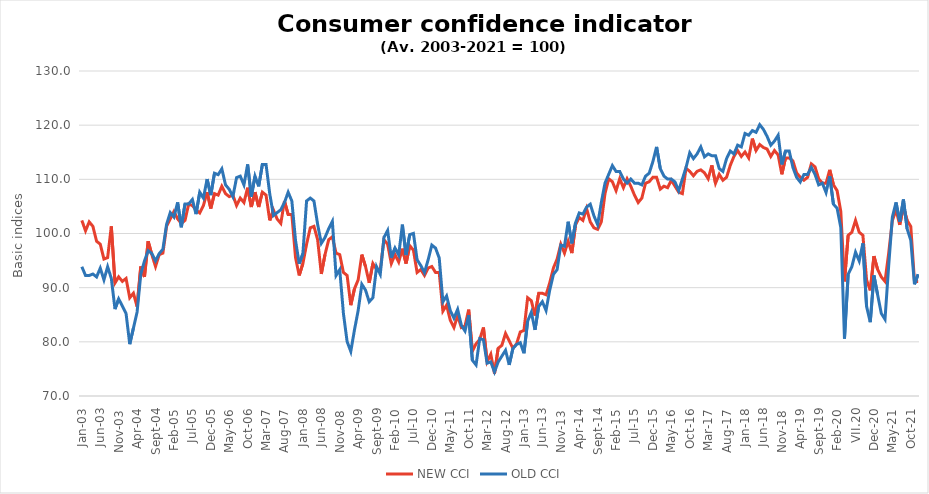
| Category | NEW CCI | OLD CCI |
|---|---|---|
| I.03 | 102.418 | 93.867 |
| II.03 | 100.496 | 92.248 |
| III.03 | 102.144 | 92.248 |
| IV.03 | 101.32 | 92.518 |
| V.03 | 98.574 | 91.979 |
| VI.03 | 98.025 | 93.597 |
| VII.03 | 95.279 | 91.439 |
| VIII.03 | 95.554 | 93.867 |
| IX.03 | 101.32 | 91.709 |
| X.03 | 90.886 | 86.044 |
| XI.03 | 91.984 | 87.933 |
| XII.03 | 91.16 | 86.584 |
| I.04 | 91.71 | 85.235 |
| II.04 | 88.14 | 79.571 |
| III.04 | 88.964 | 82.538 |
| IV.04 | 86.493 | 85.505 |
| V.04 | 93.906 | 92.518 |
| VI.04 | 91.984 | 94.946 |
| VII.04 | 98.574 | 96.834 |
| VIII.04 | 96.103 | 96.294 |
| IX.04 | 93.906 | 94.946 |
| X.04 | 96.103 | 96.294 |
| XI.04 | 96.377 | 97.103 |
| XII.04 | 101.32 | 101.689 |
| I.05 | 102.693 | 103.847 |
| II.05 | 104.066 | 103.038 |
| III.05 | 102.693 | 105.735 |
| IV.05 | 101.869 | 101.149 |
| V.05 | 102.418 | 105.465 |
| VI.05 | 105.439 | 105.465 |
| VII.05 | 105.164 | 106.274 |
| VIII.05 | 104.34 | 103.577 |
| IX.05 | 103.791 | 107.623 |
| X.05 | 105.164 | 106.544 |
| XI.05 | 107.635 | 110.051 |
| XII.05 | 104.615 | 107.084 |
| I.06 | 107.361 | 111.13 |
| II.06 | 107.086 | 110.86 |
| III.06 | 108.734 | 111.939 |
| IV.06 | 107.361 | 108.972 |
| V.06 | 106.812 | 108.162 |
| VI.06 | 107.086 | 106.814 |
| VII.06 | 105.164 | 110.32 |
| VIII.06 | 106.537 | 110.59 |
| IX.06 | 105.713 | 108.972 |
| X.06 | 108.459 | 112.748 |
| XI.06 | 104.889 | 106.814 |
| XII.06 | 107.635 | 110.59 |
| I.07 | 104.889 | 108.702 |
| II.07 | 107.635 | 112.748 |
| III.07 | 107.086 | 112.748 |
| IV.07 | 102.418 | 107.353 |
| V.07 | 104.34 | 103.307 |
| VI.07 | 102.693 | 103.847 |
| VII.07 | 101.869 | 104.386 |
| VIII.07 | 105.988 | 105.735 |
| IX.07 | 103.517 | 107.623 |
| X.07 | 103.517 | 106.005 |
| XI.07 | 95.554 | 98.722 |
| XII.07 | 92.259 | 94.406 |
| I.08 | 94.455 | 96.294 |
| II.08 | 98.025 | 106.005 |
| III.08 | 101.045 | 106.544 |
| IV.08 | 101.32 | 106.005 |
| V.08 | 98.849 | 101.689 |
| VI.08 | 92.533 | 98.182 |
| VII.08 | 96.103 | 99.261 |
| VIII.08 | 98.849 | 100.88 |
| IX.08 | 99.398 | 102.228 |
| X.08 | 96.377 | 92.248 |
| XI.08 | 96.103 | 93.327 |
| XII.08 | 92.808 | 85.235 |
| I.09 | 92.259 | 80.056 |
| II.09 | 86.767 | 78.222 |
| III.09 | 89.788 | 82.214 |
| IV.09 | 91.435 | 85.775 |
| V.09 | 96.103 | 90.63 |
| VI.09 | 93.906 | 89.551 |
| VII.09 | 90.886 | 87.393 |
| VIII.09 | 94.455 | 88.148 |
| IX.09 | 93.357 | 93.867 |
| X.09 | 93.357 | 92.464 |
| XI.09 | 98.849 | 99.261 |
| XII.09 | 98.025 | 100.556 |
| I.10 | 94.455 | 95.485 |
| II.10 | 96.103 | 97.319 |
| III.10 | 94.73 | 96.025 |
| IV.10 | 97.201 | 101.635 |
| V.10 | 94.455 | 96.025 |
| VI.10 | 97.75 | 99.801 |
| VII.10 | 96.927 | 100.017 |
| VIII.10 | 92.808 | 95.161 |
| IX.10 | 93.357 | 94.082 |
| X.10 | 92.259 | 92.788 |
| XI.10 | 93.632 | 95.161 |
| XII.10 | 93.906 | 97.859 |
| I.11 | 92.808 | 97.319 |
| II.11 | 92.808 | 95.485 |
| III.11 | 85.669 | 87.393 |
| IV.11 | 86.767 | 88.472 |
| V.11 | 84.021 | 85.775 |
| VI.11 | 82.648 | 84.372 |
| VII.11 | 84.845 | 85.991 |
| VIII.11 | 82.648 | 83.077 |
| IX.11 | 82.923 | 81.998 |
| X.11 | 85.943 | 84.912 |
| XI.11 | 78.255 | 76.604 |
| XII.11 | 79.628 | 75.741 |
| I.12 | 80.452 | 80.596 |
| II.12 | 82.648 | 80.38 |
| III.12 | 76.333 | 76.064 |
| IV.12 | 77.706 | 76.28 |
| V.12 | 74.137 | 74.446 |
| VI.12 | 78.804 | 76.28 |
| VII.12 | 79.354 | 77.359 |
| VIII.12 | 81.55 | 78.438 |
| IX.12 | 80.177 | 75.741 |
| X.12 | 78.804 | 78.762 |
| XI.12 | 79.628 | 79.517 |
| XII.12 | 81.825 | 79.841 |
| I.13 | 82.099 | 77.899 |
| II.13 | 88.14 | 83.833 |
| III.13 | 87.591 | 85.451 |
| IV.13 | 84.845 | 82.214 |
| V.13 | 88.964 | 86.53 |
| VI.13 | 88.964 | 87.393 |
| VII.13 | 88.689 | 85.775 |
| VIII.13 | 90.886 | 89.551 |
| IX.13 | 93.632 | 92.464 |
| X.13 | 95.279 | 93.327 |
| XI.13 | 98.025 | 97.859 |
| XII.13 | 96.377 | 97.643 |
| I.14 | 98.574 | 102.174 |
| II.14 | 96.377 | 98.182 |
| III.14 | 101.594 | 101.959 |
| IV.14 | 102.967 | 103.793 |
| V.14 | 102.418 | 103.577 |
| VI.14 | 104.615 | 104.872 |
| VII.14 | 102.144 | 105.411 |
| VIII.14 | 101.045 | 103.253 |
| IX.14 | 100.771 | 101.635 |
| X.14 | 102.144 | 105.735 |
| XI.14 | 107.361 | 109.295 |
| XII.14 | 110.106 | 110.914 |
| I.15 | 109.557 | 112.532 |
| II.15 | 107.91 | 111.453 |
| III.15 | 110.106 | 111.453 |
| IV.15 | 108.459 | 110.051 |
| V.15 | 110.106 | 109.295 |
| VI.15 | 108.734 | 110.051 |
| VII.15 | 107.086 | 109.295 |
| VIII.15 | 105.713 | 109.295 |
| IX.15 | 106.537 | 108.972 |
| X.15 | 109.283 | 110.59 |
| XI.15 | 109.557 | 111.13 |
| XII.15 | 110.381 | 113.287 |
| I.16 | 110.381 | 115.985 |
| II.16 | 108.184 | 111.993 |
| III.16 | 108.734 | 110.59 |
| IV.16 | 108.459 | 110.051 |
| V.16 | 109.832 | 110.051 |
| VI.16 | 108.734 | 109.511 |
| VII.16 | 107.635 | 107.893 |
| VIII.16 | 107.361 | 110.051 |
| IX.16 | 112.029 | 112.208 |
| X.16 | 111.479 | 114.906 |
| XI.16 | 110.656 | 113.827 |
| XII.16 | 111.479 | 114.69 |
| I.17 | 111.754 | 115.985 |
| II.17 | 111.205 | 114.151 |
| III.17 | 110.106 | 114.69 |
| IV.17 | 112.578 | 114.366 |
| V.17 | 109.283 | 114.366 |
| VI.17 | 110.93 | 111.993 |
| VII.17 | 109.832 | 111.453 |
| VIII.17 | 110.381 | 113.827 |
| IX.17 | 112.578 | 115.229 |
| X.17 | 114.225 | 114.69 |
| XI.17 | 115.323 | 116.308 |
| XII.17 | 114.225 | 115.985 |
| I.18 | 115.049 | 118.466 |
| II.18 | 113.951 | 118.143 |
| III.18 | 117.52 | 119.006 |
| IV.18 | 115.323 | 118.682 |
| V.18 | 116.422 | 120.085 |
| VI.18 | 115.873 | 119.221 |
| VII.18 | 115.598 | 117.927 |
| VIII.18 | 114.225 | 116.308 |
| IX.18 | 115.323 | 117.064 |
| X.18 | 114.5 | 118.143 |
| XI.18 | 110.93 | 112.748 |
| XII.18 | 113.951 | 115.229 |
| I.19 | 113.951 | 115.229 |
| II.19 | 113.401 | 112.208 |
| III.19 | 111.205 | 110.374 |
| IV.19 | 110.381 | 109.511 |
| V.19 | 109.832 | 110.914 |
| VI.19 | 110.381 | 110.914 |
| VII.19 | 112.852 | 112.208 |
| VIII.19 | 112.303 | 110.914 |
| IX.19 | 110.106 | 108.972 |
| X.19 | 109.283 | 109.295 |
| XI.19 | 109.283 | 107.569 |
| XII.19 | 111.754 | 110.59 |
| I.20 | 109.008 | 105.411 |
| II.20 | 107.91 | 104.656 |
| III.20 | 104.066 | 101.095 |
| IV.20 | 91.16 | 80.596 |
| V.20 | 99.672 | 92.464 |
| VI.20 | 100.222 | 93.867 |
| VII.20 | 102.418 | 96.564 |
| VIII.20 | 100.222 | 94.946 |
| IX.20 | 99.672 | 98.182 |
| X.20 | 91.435 | 86.53 |
| XI.20 | 89.513 | 83.617 |
| XII.20 | 95.828 | 92.248 |
| I.21 | 93.357 | 88.688 |
| II.21 | 91.984 | 85.235 |
| III.21 | 91.16 | 84.156 |
| IV.21 | 96.377 | 94.082 |
| V.21 | 102.418 | 103.038 |
| VI.21 | 104.34 | 105.735 |
| VII.21 | 101.594 | 102.174 |
| VIII.21 | 104.889 | 106.274 |
| IX.21 | 102.418 | 100.88 |
| X.21 | 101.3 | 98.722 |
| XI.21 | 91.16 | 90.63 |
| XII.21 | 91.16 | 92.464 |